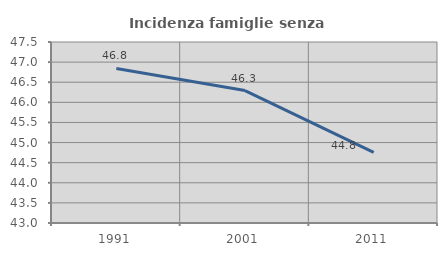
| Category | Incidenza famiglie senza nuclei |
|---|---|
| 1991.0 | 46.843 |
| 2001.0 | 46.293 |
| 2011.0 | 44.757 |